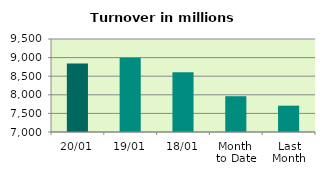
| Category | Series 0 |
|---|---|
| 20/01 | 8839.148 |
| 19/01 | 8994.137 |
| 18/01 | 8605.396 |
| Month 
to Date | 7962.394 |
| Last
Month | 7707.734 |